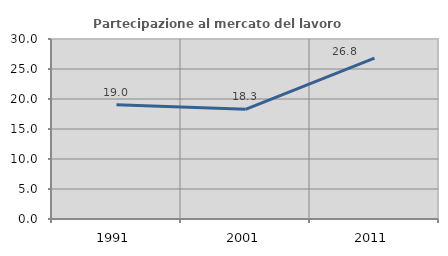
| Category | Partecipazione al mercato del lavoro  femminile |
|---|---|
| 1991.0 | 19.048 |
| 2001.0 | 18.28 |
| 2011.0 | 26.829 |